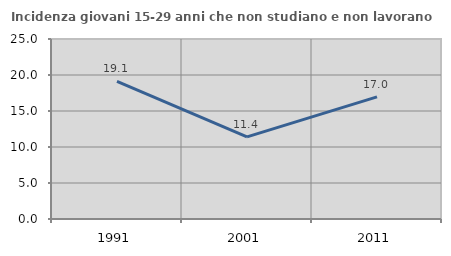
| Category | Incidenza giovani 15-29 anni che non studiano e non lavorano  |
|---|---|
| 1991.0 | 19.107 |
| 2001.0 | 11.399 |
| 2011.0 | 16.97 |